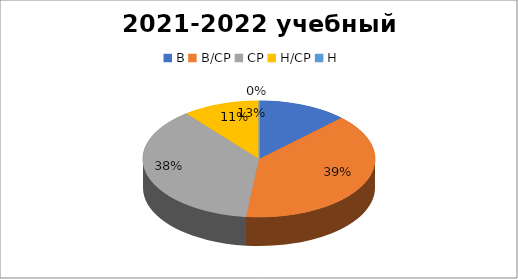
| Category | Series 0 | Series 1 |
|---|---|---|
| В | 7 | 11 |
| В/СР | 22 | 27 |
| СР | 21 | 15 |
| Н/СР | 6 | 3 |
| Н | 0 | 0 |